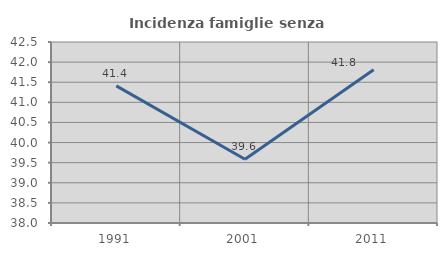
| Category | Incidenza famiglie senza nuclei |
|---|---|
| 1991.0 | 41.41 |
| 2001.0 | 39.583 |
| 2011.0 | 41.81 |